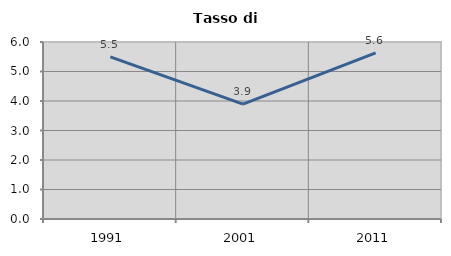
| Category | Tasso di disoccupazione   |
|---|---|
| 1991.0 | 5.497 |
| 2001.0 | 3.897 |
| 2011.0 | 5.628 |